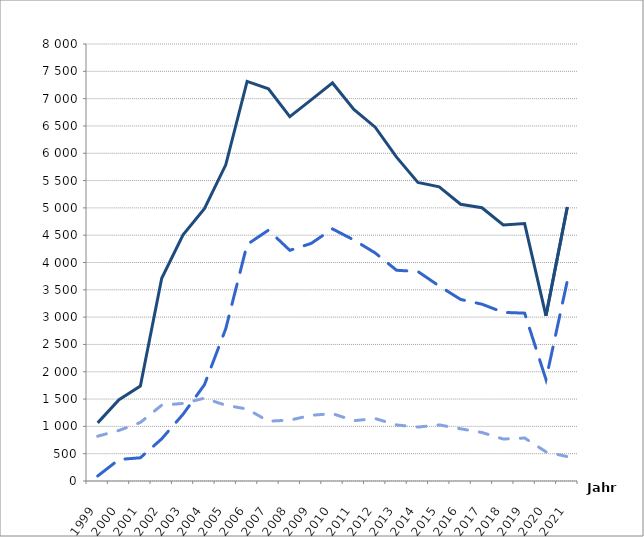
| Category | insgesamt | Unternehmen | Verbraucher:innen |
|---|---|---|---|
| 1999.0 | 1064 | 820 | 91 |
| 2000.0 | 1488 | 926 | 394 |
| 2001.0 | 1737 | 1072 | 425 |
| 2002.0 | 3712 | 1388 | 772 |
| 2003.0 | 4507 | 1420 | 1222 |
| 2004.0 | 4984 | 1516 | 1761 |
| 2005.0 | 5788 | 1387 | 2788 |
| 2006.0 | 7315 | 1317 | 4330 |
| 2007.0 | 7181 | 1095 | 4592 |
| 2008.0 | 6671 | 1114 | 4223 |
| 2009.0 | 6976 | 1203 | 4349 |
| 2010.0 | 7287 | 1233 | 4615 |
| 2011.0 | 6803 | 1104 | 4412 |
| 2012.0 | 6477 | 1143 | 4175 |
| 2013.0 | 5928 | 1026 | 3858 |
| 2014.0 | 5467 | 987 | 3835 |
| 2015.0 | 5384 | 1027 | 3569 |
| 2016.0 | 5067 | 956 | 3324 |
| 2017.0 | 5003 | 888 | 3237 |
| 2018.0 | 4688 | 768 | 3087 |
| 2019.0 | 4713 | 787 | 3073 |
| 2020.0 | 3024 | 534 | 1859 |
| 2021.0 | 5015 | 446 | 3665 |